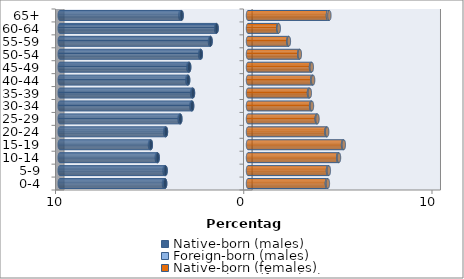
| Category | Native-born (males) | Foreign-born (males) | Native-born (females) | Foreign-born (females) |
|---|---|---|---|---|
| 0-4 | -4.402 | -0.062 | 4.192 | 0.052 |
| 5-9 | -4.379 | -0.056 | 4.248 | 0.047 |
| 10-14 | -4.798 | -0.051 | 4.79 | 0.044 |
| 15-19 | -5.162 | -0.047 | 5.048 | 0.041 |
| 20-24 | -4.359 | -0.044 | 4.165 | 0.04 |
| 25-29 | -3.595 | -0.041 | 3.651 | 0.041 |
| 30-34 | -2.969 | -0.043 | 3.353 | 0.043 |
| 35-39 | -2.924 | -0.045 | 3.239 | 0.046 |
| 40-44 | -3.18 | -0.047 | 3.414 | 0.045 |
| 45-49 | -3.125 | -0.046 | 3.347 | 0.041 |
| 50-54 | -2.505 | -0.041 | 2.718 | 0.035 |
| 55-59 | -1.988 | -0.033 | 2.142 | 0.03 |
| 60-64 | -1.669 | -0.024 | 1.609 | 0.023 |
| 65+ | -3.527 | -0.069 | 4.247 | 0.076 |